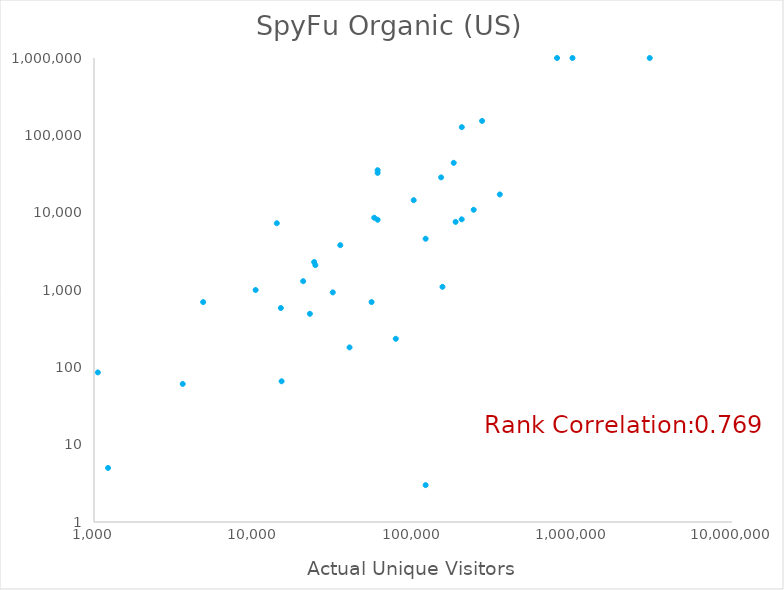
| Category | SpyFu Organic (US) |
|---|---|
| 57127.0 | 8600 |
| 14843.0 | 585 |
| 120000.0 | 4600 |
| 24000.0 | 2300 |
| 3600.0 | 61 |
| 150000.0 | 28600 |
| 185000.0 | 7600 |
| 240080.0 | 10900 |
| 31412.0 | 931 |
| 22569.0 | 492 |
| 153037.0 | 1100 |
| 78000.0 | 234 |
| 202000.0 | 8200 |
| 24417.0 | 2100 |
| 60000.0 | 35400 |
| 35000.0 | 3800 |
| 1000000.0 | 1000000 |
| 350000.0 | 17200 |
| 20485.0 | 1300 |
| 271059.0 | 153500 |
| 101000.0 | 14500 |
| 800000.0 | 1000000 |
| 60000.0 | 8100 |
| 180000.0 | 44100 |
| 15000.0 | 66 |
| 14000.0 | 7300 |
| 55000.0 | 698 |
| 1057.0 | 86 |
| 10313.0 | 1000 |
| 1225.0 | 5 |
| 60000.0 | 32700 |
| 6790.0 | 0 |
| 202310.0 | 127700 |
| 40000.0 | 181 |
| 120000.0 | 3 |
| 3050000.0 | 1000000 |
| 4835.0 | 698 |